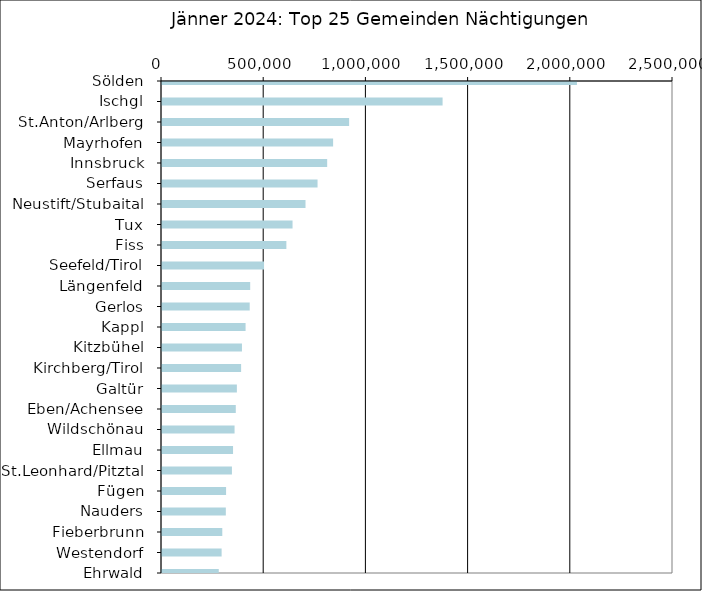
| Category | Series 0 |
|---|---|
| Sölden | 2030075 |
| Ischgl | 1372722 |
| St.Anton/Arlberg | 915452 |
| Mayrhofen | 837111 |
| Innsbruck | 808074 |
| Serfaus | 760977 |
| Neustift/Stubaital | 702116 |
| Tux | 638656 |
| Fiss | 608480 |
| Seefeld/Tirol | 499242 |
| Längenfeld | 431448 |
| Gerlos | 429094 |
| Kappl | 408860 |
| Kitzbühel | 391197 |
| Kirchberg/Tirol | 387028 |
| Galtür | 366308 |
| Eben/Achensee | 361015 |
| Wildschönau | 354971 |
| Ellmau | 347525 |
| St.Leonhard/Pitztal | 342111 |
| Fügen | 313475 |
| Nauders | 312261 |
| Fieberbrunn | 294936 |
| Westendorf | 291665 |
| Ehrwald | 277718 |